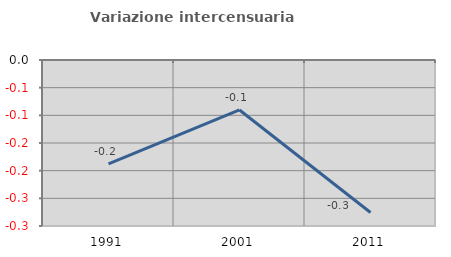
| Category | Variazione intercensuaria annua |
|---|---|
| 1991.0 | -0.188 |
| 2001.0 | -0.09 |
| 2011.0 | -0.276 |